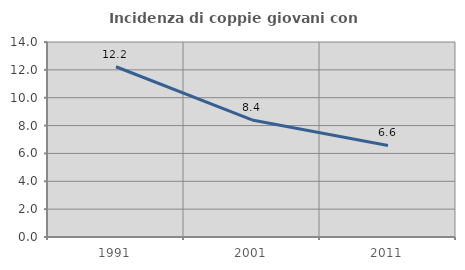
| Category | Incidenza di coppie giovani con figli |
|---|---|
| 1991.0 | 12.222 |
| 2001.0 | 8.403 |
| 2011.0 | 6.569 |